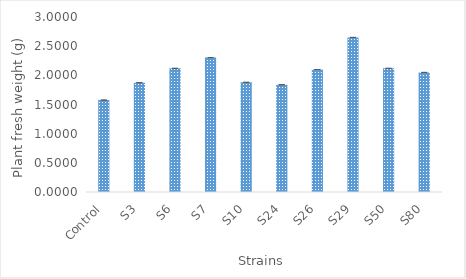
| Category | plant fresh weight |
|---|---|
| Control | 1.576 |
| S3 | 1.875 |
| S6 | 2.12 |
| S7 | 2.305 |
| S10 | 1.88 |
| S24 | 1.84 |
| S26 | 2.1 |
| S29 | 2.65 |
| S50 | 2.12 |
| S80 | 2.05 |